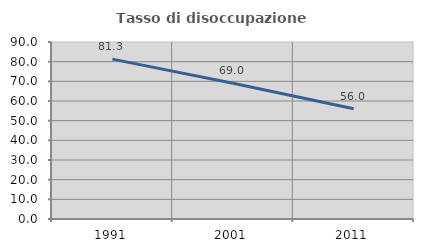
| Category | Tasso di disoccupazione giovanile  |
|---|---|
| 1991.0 | 81.281 |
| 2001.0 | 68.985 |
| 2011.0 | 56.027 |